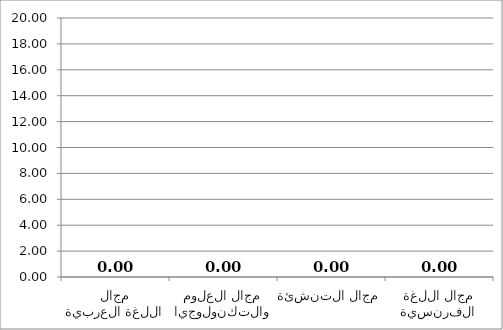
| Category | Series 0 |
|---|---|
| مجال اللغة العربية | 0 |
| مجال العلوم والتكنولوجيا | 0 |
| مجال التنشئة | 0 |
| مجال اللغة الفرنسية | 0 |